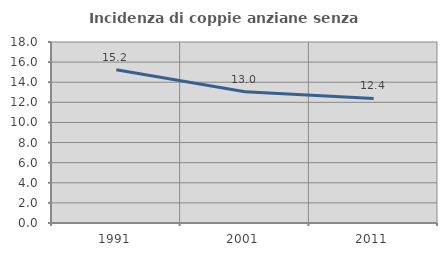
| Category | Incidenza di coppie anziane senza figli  |
|---|---|
| 1991.0 | 15.244 |
| 2001.0 | 13.043 |
| 2011.0 | 12.392 |